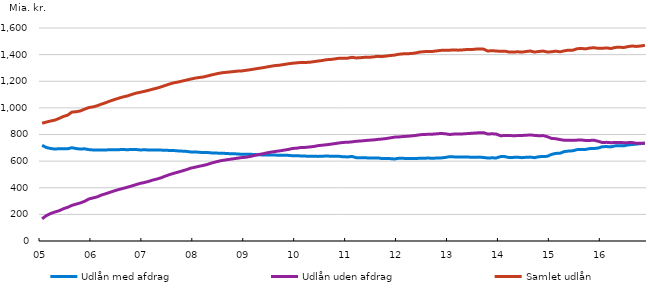
| Category | Udlån med afdrag | Udlån uden afdrag | Samlet udlån |
|---|---|---|---|
| 05 | 718436594000 | 166428946000 | 884865540000 |
|  | 702494689000 | 190887646000 | 893382335000 |
|  | 694863248000 | 206517097000 | 901380345000 |
|  | 690394136000 | 217751089000 | 908145225000 |
|  | 693552560000 | 227299036000 | 920851596000 |
|  | 693512456000 | 241860473000 | 935372929000 |
|  | 692505419000 | 252491488000 | 944996907000 |
|  | 700814445000 | 267366696000 | 968181141000 |
|  | 694304732000 | 276858447000 | 971163179000 |
|  | 690894659000 | 286077757000 | 976972416000 |
|  | 692519688000 | 298018031000 | 990537719000 |
|  | 686495934000 | 315493896000 | 1001989830000 |
| 06 | 683858439000 | 323494096000 | 1007352535000 |
|  | 684348076000 | 331794715000 | 1016142791000 |
|  | 682947710000 | 345547493000 | 1028495203000 |
|  | 683890038000 | 355205079000 | 1039095117000 |
|  | 685673848000 | 366008009000 | 1051681857000 |
|  | 685040079000 | 376789637000 | 1061829716000 |
|  | 686080764000 | 386188997000 | 1072269761000 |
|  | 687134380000 | 394516720000 | 1081651100000 |
|  | 685893274000 | 403261859000 | 1089155133000 |
|  | 686919399000 | 412349852000 | 1099269251000 |
|  | 687495579000 | 422293471000 | 1109789050000 |
|  | 684316430000 | 432174521000 | 1116490951000 |
| 07 | 684619244000 | 438887148000 | 1123506392000 |
|  | 684401702000 | 446945495000 | 1131347197000 |
|  | 682644248000 | 457142479000 | 1139786727000 |
|  | 682834814000 | 464918067000 | 1147752881000 |
|  | 682979001000 | 474584324000 | 1157563325000 |
|  | 681328539000 | 486994023000 | 1168322562000 |
|  | 680476583000 | 498514799000 | 1178991382000 |
|  | 679790805000 | 508267561000 | 1188058366000 |
|  | 676695282000 | 517090954000 | 1193786236000 |
|  | 675008622000 | 526492132000 | 1201500754000 |
|  | 673142557000 | 535858218000 | 1209000775000 |
|  | 668845290000 | 547261751000 | 1216107041000 |
| 08 | 669219926000 | 554105878000 | 1223325804000 |
|  | 666692703000 | 561368965000 | 1228061668000 |
|  | 664138769000 | 567867261000 | 1232006030000 |
|  | 664574159000 | 575720696000 | 1240294855000 |
|  | 661628907000 | 586497732000 | 1248126639000 |
|  | 660433841000 | 594801775000 | 1255235616000 |
|  | 659366139000 | 602530407000 | 1261896546000 |
|  | 658329386000 | 607660954000 | 1265990340000 |
|  | 656171391000 | 612698520000 | 1268869911000 |
|  | 655312432000 | 617255736000 | 1272568168000 |
|  | 654022284000 | 621985566000 | 1276007850000 |
|  | 651049616000 | 626427869000 | 1277477485000 |
| 09 | 652477470000 | 629405926000 | 1281883396000 |
|  | 651636951000 | 634922783000 | 1286559734000 |
|  | 649557571000 | 642148167000 | 1291705738000 |
|  | 647726938000 | 649399169000 | 1297126107000 |
|  | 646468772000 | 655154547000 | 1301623319000 |
|  | 645253593000 | 662262172000 | 1307515765000 |
|  | 645280458000 | 668030231000 | 1313310689000 |
|  | 645309841000 | 672843492000 | 1318153333000 |
|  | 643671390000 | 677113892000 | 1320785282000 |
|  | 643577377000 | 682416008000 | 1325993385000 |
|  | 643219009000 | 687953208000 | 1331172217000 |
|  | 640316781000 | 695099724000 | 1335416505000 |
| 10 | 640782107000 | 697497724000 | 1338279831000 |
|  | 638812329000 | 702505940000 | 1341318269000 |
|  | 637722896000 | 703264880000 | 1340987776000 |
|  | 636591497000 | 706245709000 | 1342837206000 |
|  | 636983874000 | 710028946000 | 1347012820000 |
|  | 635529539000 | 716372027000 | 1351901566000 |
|  | 636310541000 | 719636341000 | 1355946882000 |
|  | 638967817000 | 722906080000 | 1361873897000 |
|  | 636488583000 | 727200602000 | 1363689185000 |
|  | 636191561000 | 731765755000 | 1367957316000 |
|  | 636140595000 | 736733868000 | 1372874463000 |
|  | 632150436000 | 740608235000 | 1372758671000 |
| 11 | 631777198000 | 741586445000 | 1373363643000 |
|  | 634968625000 | 744819738000 | 1379788363000 |
|  | 625954049000 | 749096946000 | 1375050995000 |
|  | 625834790000 | 751234101000 | 1377068891000 |
|  | 625803089000 | 754034687000 | 1379837776000 |
|  | 622955592000 | 757099951000 | 1380055543000 |
|  | 623157757000 | 759290744000 | 1382448501000 |
|  | 624403015000 | 762866895000 | 1387269910000 |
|  | 619628900000 | 765756924000 | 1385385824000 |
|  | 619507974000 | 769495260000 | 1389003234000 |
|  | 618772526000 | 774640165000 | 1393412691000 |
|  | 616031026000 | 780161443000 | 1396192469000 |
| 12 | 621200905000 | 781616945000 | 1402817850000 |
|  | 620998600000 | 784625737000 | 1405624337000 |
|  | 619762184000 | 786767871000 | 1406530055000 |
|  | 618970124000 | 789482942000 | 1408453066000 |
|  | 620035959000 | 792773770000 | 1412809729000 |
|  | 621167059000 | 798342168000 | 1419509227000 |
|  | 622043941000 | 800144255000 | 1422188196000 |
|  | 622888578000 | 801514432000 | 1424403010000 |
|  | 621558137000 | 802520567000 | 1424078704000 |
|  | 623183550000 | 805027806000 | 1428211356000 |
|  | 624111618000 | 807882612000 | 1431994230000 |
|  | 627856779000 | 805281457000 | 1433138236000 |
| 13 | 633417731000 | 799931293000 | 1433349024000 |
|  | 631988335000 | 803224714000 | 1435213049000 |
|  | 630356198000 | 803193912000 | 1433550110000 |
|  | 631120525000 | 804247056000 | 1435367581000 |
|  | 631757090000 | 806435861000 | 1438192951000 |
|  | 629014362000 | 808660890000 | 1437675252000 |
|  | 629882176000 | 811123945000 | 1441006121000 |
|  | 630070825000 | 813133335000 | 1443204160000 |
|  | 627211474000 | 814103559000 | 1441315033000 |
|  | 623627762463.259 | 803286214458.349 | 1426913976921.608 |
|  | 624699080169.74 | 805366945302.15 | 1430066025471.891 |
|  | 623898557287.11 | 803077395867.02 | 1426975953154.131 |
| 14 | 633994317423.69 | 790702472186.2 | 1424696789609.89 |
|  | 633821649519.01 | 792370207561.02 | 1426191857080.03 |
|  | 626754354332.5 | 792637061113 | 1419391415445.5 |
|  | 628025863886.54 | 790692848394.72 | 1418718712281.26 |
|  | 629813429789 | 791706495620 | 1421519925409 |
|  | 625921692468 | 792748325289 | 1418670017757 |
|  | 628882036567 | 794488498110 | 1423370534677 |
|  | 630230186405.82 | 796850387308.22 | 1427080573714.04 |
|  | 625918723689.82 | 793325097952.81 | 1419243821642.63 |
|  | 632904228126.12 | 790644029572.44 | 1423548257698.56 |
|  | 635102812682.36 | 791715458217.91 | 1426818270900.27 |
|  | 635944330718.16 | 783936228998.13 | 1419880559716.29 |
| 15 | 650276041185.77 | 770787476159.83 | 1421063517345.6 |
|  | 658021362323.21 | 768242788580.82 | 1426264150904.03 |
|  | 659065427710.64 | 761893202599.74 | 1420958630310.38 |
|  | 671585026977.7 | 756763314198.08 | 1428348341175.78 |
|  | 675763005734.22 | 757697471389.92 | 1433460477124.14 |
|  | 677432483061.42 | 755768816868.25 | 1433201299929.67 |
|  | 686263557182 | 757722925071 | 1443986482253 |
|  | 687783893907 | 759155144854 | 1446939038761 |
|  | 687740342489 | 755072967074 | 1442813309563 |
|  | 693995893338.64 | 755475319779.46 | 1449471213118.1 |
|  | 694721165234.18 | 756802997038.71 | 1451524162272.89 |
|  | 698366633114.29 | 749318285384.11 | 1447684918498.4 |
| 16 | 708476629713.58 | 739064112145.94 | 1447540741859.52 |